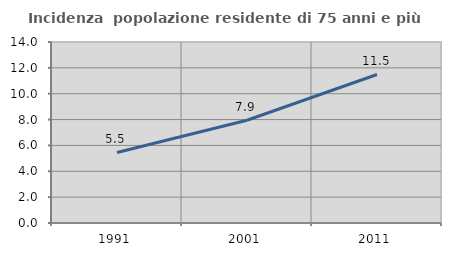
| Category | Incidenza  popolazione residente di 75 anni e più |
|---|---|
| 1991.0 | 5.458 |
| 2001.0 | 7.946 |
| 2011.0 | 11.487 |